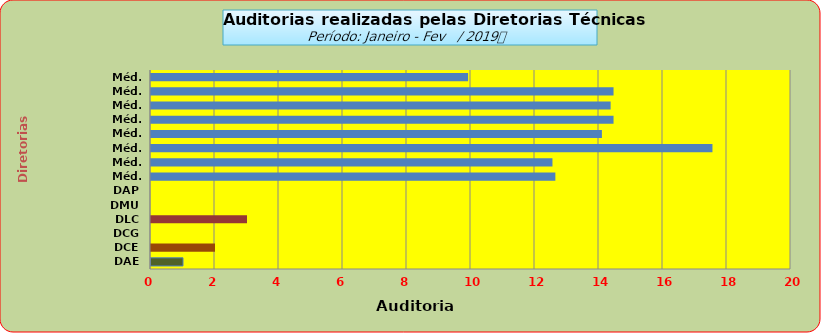
| Category | Series 0 |
|---|---|
| DAE | 1 |
| DCE | 2 |
| DCG | 0 |
| DLC | 3 |
| DMU | 0 |
| DAP | 0 |
| Méd. 2011 | 12.636 |
| Méd. 2012 | 12.545 |
| Méd. 2013 | 17.545 |
| Méd. 2014 | 14.091 |
| Méd. 2015 | 14.455 |
| Méd. 2016 | 14.364 |
| Méd. 2017 | 14.455 |
| Méd. 2018 | 9.909 |